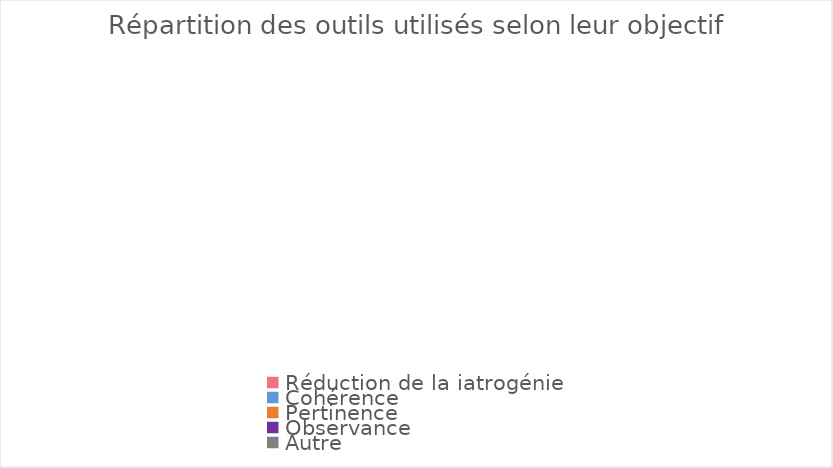
| Category | Series 0 |
|---|---|
| Réduction de la iatrogénie | 0 |
| Cohérence  | 0 |
| Pertinence | 0 |
| Observance  | 0 |
| Autre | 0 |